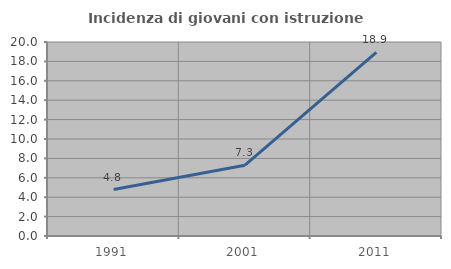
| Category | Incidenza di giovani con istruzione universitaria |
|---|---|
| 1991.0 | 4.786 |
| 2001.0 | 7.299 |
| 2011.0 | 18.93 |